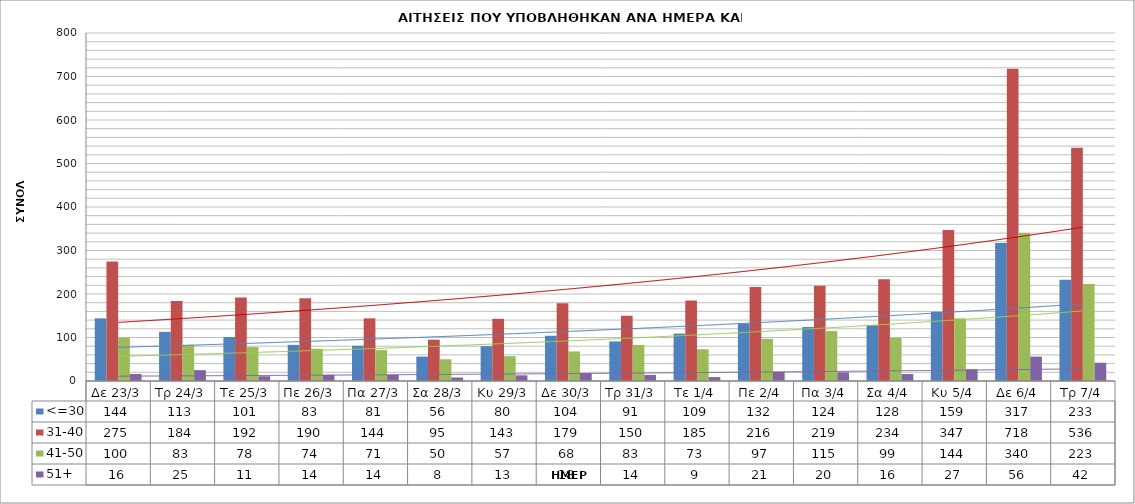
| Category | <=30 | 31-40 | 41-50 | 51+ |
|---|---|---|---|---|
| Δε 23/3 | 144 | 275 | 100 | 16 |
| Τρ 24/3 | 113 | 184 | 83 | 25 |
| Τε 25/3 | 101 | 192 | 78 | 11 |
| Πε 26/3 | 83 | 190 | 74 | 14 |
| Πα 27/3 | 81 | 144 | 71 | 14 |
| Σα 28/3 | 56 | 95 | 50 | 8 |
| Κυ 29/3 | 80 | 143 | 57 | 13 |
| Δε 30/3 | 104 | 179 | 68 | 18 |
| Τρ 31/3 | 91 | 150 | 83 | 14 |
| Τε 1/4 | 109 | 185 | 73 | 9 |
| Πε 2/4 | 132 | 216 | 97 | 21 |
| Πα 3/4 | 124 | 219 | 115 | 20 |
| Σα 4/4 | 128 | 234 | 99 | 16 |
| Κυ 5/4 | 159 | 347 | 144 | 27 |
| Δε 6/4 | 317 | 718 | 340 | 56 |
| Τρ 7/4 | 233 | 536 | 223 | 42 |